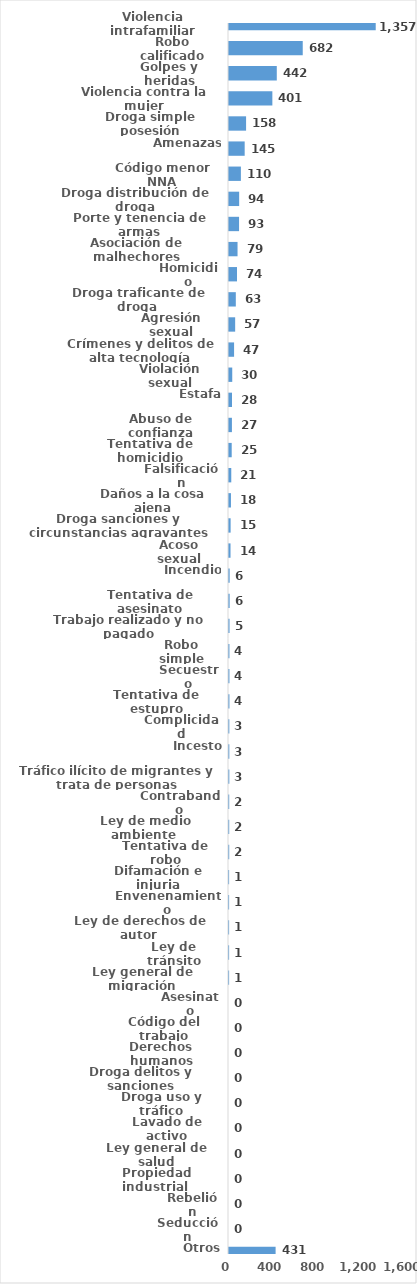
| Category | Series 0 |
|---|---|
| Violencia intrafamiliar | 1357 |
| Robo calificado | 682 |
| Golpes y heridas | 442 |
| Violencia contra la mujer | 401 |
| Droga simple posesión | 158 |
| Amenazas | 145 |
| Código menor NNA | 110 |
| Droga distribución de droga | 94 |
| Porte y tenencia de armas | 93 |
| Asociación de malhechores | 79 |
| Homicidio | 74 |
| Droga traficante de droga  | 63 |
| Agresión sexual | 57 |
| Crímenes y delitos de alta tecnología | 47 |
| Violación sexual | 30 |
| Estafa | 28 |
| Abuso de confianza | 27 |
| Tentativa de homicidio | 25 |
| Falsificación | 21 |
| Daños a la cosa ajena | 18 |
| Droga sanciones y circunstancias agravantes | 15 |
| Acoso sexual | 14 |
| Incendio | 6 |
| Tentativa de asesinato | 6 |
| Trabajo realizado y no pagado | 5 |
| Robo simple | 4 |
| Secuestro | 4 |
| Tentativa de estupro | 4 |
| Complicidad | 3 |
| Incesto | 3 |
| Tráfico ilícito de migrantes y trata de personas | 3 |
| Contrabando | 2 |
| Ley de medio ambiente  | 2 |
| Tentativa de robo | 2 |
| Difamación e injuria | 1 |
| Envenenamiento | 1 |
| Ley de derechos de autor  | 1 |
| Ley de tránsito | 1 |
| Ley general de migración | 1 |
| Asesinato | 0 |
| Código del trabajo | 0 |
| Derechos humanos | 0 |
| Droga delitos y sanciones | 0 |
| Droga uso y tráfico | 0 |
| Lavado de activo | 0 |
| Ley general de salud | 0 |
| Propiedad industrial  | 0 |
| Rebelión | 0 |
| Seducción | 0 |
| Otros | 431 |